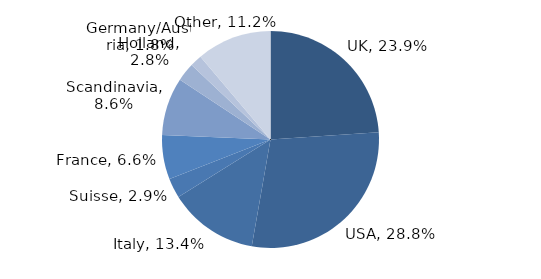
| Category | Investment Style |
|---|---|
| UK | 0.239 |
| USA | 0.288 |
| Italy | 0.134 |
| Suisse | 0.029 |
| France | 0.066 |
| Scandinavia | 0.086 |
| Holland | 0.028 |
| Germany/Austria | 0.018 |
| Other | 0.112 |